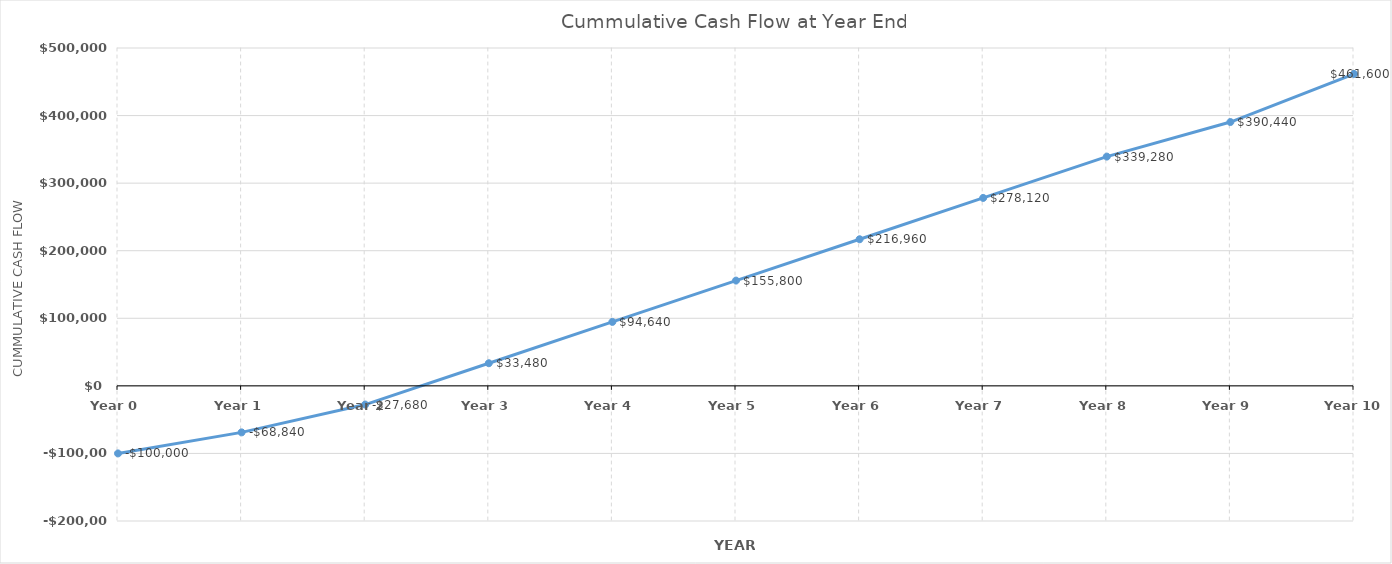
| Category | Series 0 |
|---|---|
| Year 0 | -100000 |
| Year 1 | -68840 |
| Year 2 | -27680 |
| Year 3 | 33480 |
| Year 4 | 94640 |
| Year 5 | 155800 |
| Year 6 | 216960 |
| Year 7 | 278120 |
| Year 8 | 339280 |
| Year 9 | 390440 |
| Year 10 | 461600 |